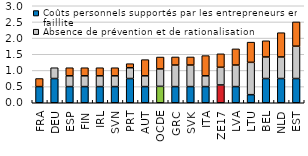
| Category | Coûts personnels supportés par les entrepreneurs en cas de faillite | Absence de prévention et de rationalisation | Obstacles à la restructuration |
|---|---|---|---|
| FRA | 0.5 | 0 | 0.25 |
| DEU | 0.75 | 0.333 | 0 |
| ESP | 0.5 | 0.333 | 0.25 |
| FIN | 0.5 | 0.333 | 0.25 |
| IRL | 0.5 | 0.333 | 0.25 |
| SVN | 0.5 | 0.333 | 0.25 |
| PRT | 0.75 | 0.333 | 0.125 |
| AUT | 0.5 | 0.333 | 0.5 |
| OCDE | 0.507 | 0.539 | 0.368 |
| GRC | 0.5 | 0.667 | 0.25 |
| SVK | 0.5 | 0.667 | 0.25 |
| ITA | 0.5 | 0.333 | 0.625 |
| ZE17 | 0.55 | 0.547 | 0.416 |
| LVA | 0.5 | 0.667 | 0.5 |
| LTU | 0.25 | 1 | 0.625 |
| BEL | 0.75 | 0.667 | 0.5 |
| NLD | 0.75 | 0.667 | 0.75 |
| EST | 0.75 | 1 | 0.75 |